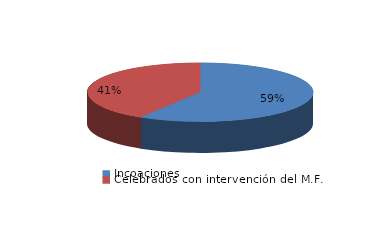
| Category | Series 0 |
|---|---|
| Incoaciones | 17618 |
| Celebrados con intervención del M.F. | 12384 |